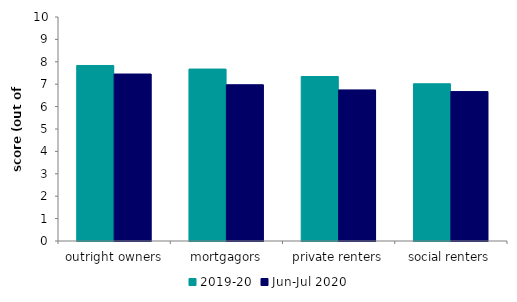
| Category | 2019-20 | Jun-Jul 2020 |
|---|---|---|
| outright owners | 7.836 | 7.455 |
| mortgagors | 7.675 | 6.976 |
| private renters | 7.344 | 6.745 |
| social renters | 7.018 | 6.67 |